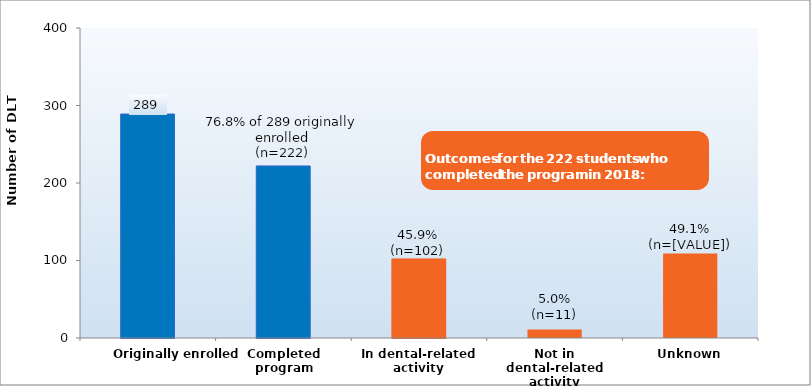
| Category | Series 0 |
|---|---|
| Originally enrolled | 289 |
| Completed program | 222 |
| In dental-related activity | 102 |
| Not in dental-related activity | 11 |
| Unknown | 109 |